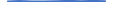
| Category | Series 0 |
|---|---|
| 0 | 5 |
| 1 | 10 |
| 2 | 4 |
| 3 | 6 |
| 4 | 8 |
| 5 | 11 |
| 6 | 8 |
| 7 | 11 |
| 8 | 7 |